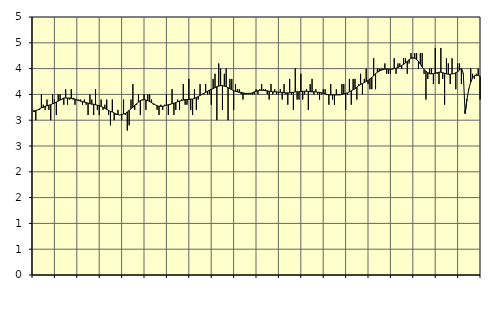
| Category | Personliga och kulturella tjänster, SNI 90-98 | Series 1 |
|---|---|---|
| nan | 3.2 | 3.16 |
| 1.0 | 3 | 3.19 |
| 1.0 | 3.2 | 3.2 |
| 1.0 | 3.2 | 3.22 |
| 1.0 | 3.5 | 3.24 |
| 1.0 | 3.3 | 3.25 |
| 1.0 | 3.2 | 3.27 |
| 1.0 | 3.4 | 3.28 |
| 1.0 | 3.2 | 3.29 |
| 1.0 | 3 | 3.3 |
| 1.0 | 3.5 | 3.32 |
| 1.0 | 3.4 | 3.33 |
| nan | 3.1 | 3.35 |
| 2.0 | 3.5 | 3.37 |
| 2.0 | 3.5 | 3.39 |
| 2.0 | 3.4 | 3.41 |
| 2.0 | 3.3 | 3.43 |
| 2.0 | 3.6 | 3.43 |
| 2.0 | 3.3 | 3.43 |
| 2.0 | 3.4 | 3.43 |
| 2.0 | 3.6 | 3.42 |
| 2.0 | 3.4 | 3.42 |
| 2.0 | 3.3 | 3.41 |
| 2.0 | 3.4 | 3.39 |
| nan | 3.4 | 3.38 |
| 3.0 | 3.4 | 3.37 |
| 3.0 | 3.3 | 3.36 |
| 3.0 | 3.4 | 3.35 |
| 3.0 | 3.3 | 3.34 |
| 3.0 | 3.1 | 3.33 |
| 3.0 | 3.5 | 3.32 |
| 3.0 | 3.4 | 3.31 |
| 3.0 | 3.1 | 3.31 |
| 3.0 | 3.6 | 3.3 |
| 3.0 | 3.2 | 3.29 |
| 3.0 | 3.1 | 3.28 |
| nan | 3.4 | 3.27 |
| 4.0 | 3.2 | 3.25 |
| 4.0 | 3.3 | 3.23 |
| 4.0 | 3.4 | 3.21 |
| 4.0 | 3.1 | 3.19 |
| 4.0 | 2.9 | 3.17 |
| 4.0 | 3.4 | 3.16 |
| 4.0 | 3 | 3.14 |
| 4.0 | 3.1 | 3.12 |
| 4.0 | 3.2 | 3.11 |
| 4.0 | 3.1 | 3.1 |
| 4.0 | 3 | 3.11 |
| nan | 3.4 | 3.12 |
| 5.0 | 3.1 | 3.13 |
| 5.0 | 2.8 | 3.16 |
| 5.0 | 2.9 | 3.19 |
| 5.0 | 3.4 | 3.22 |
| 5.0 | 3.7 | 3.25 |
| 5.0 | 3.2 | 3.29 |
| 5.0 | 3.3 | 3.32 |
| 5.0 | 3.5 | 3.35 |
| 5.0 | 3.1 | 3.38 |
| 5.0 | 3.4 | 3.39 |
| 5.0 | 3.5 | 3.4 |
| nan | 3.2 | 3.39 |
| 6.0 | 3.5 | 3.38 |
| 6.0 | 3.5 | 3.36 |
| 6.0 | 3.4 | 3.34 |
| 6.0 | 3.3 | 3.32 |
| 6.0 | 3.3 | 3.3 |
| 6.0 | 3.2 | 3.28 |
| 6.0 | 3.1 | 3.27 |
| 6.0 | 3.3 | 3.27 |
| 6.0 | 3.2 | 3.27 |
| 6.0 | 3.3 | 3.28 |
| 6.0 | 3.5 | 3.29 |
| nan | 3.1 | 3.3 |
| 7.0 | 3.3 | 3.31 |
| 7.0 | 3.6 | 3.32 |
| 7.0 | 3.1 | 3.33 |
| 7.0 | 3.2 | 3.34 |
| 7.0 | 3.4 | 3.36 |
| 7.0 | 3.2 | 3.37 |
| 7.0 | 3.4 | 3.38 |
| 7.0 | 3.7 | 3.39 |
| 7.0 | 3.3 | 3.4 |
| 7.0 | 3.3 | 3.4 |
| 7.0 | 3.8 | 3.4 |
| nan | 3.2 | 3.41 |
| 8.0 | 3.1 | 3.41 |
| 8.0 | 3.6 | 3.42 |
| 8.0 | 3.2 | 3.44 |
| 8.0 | 3.4 | 3.46 |
| 8.0 | 3.7 | 3.48 |
| 8.0 | 3.5 | 3.5 |
| 8.0 | 3.5 | 3.52 |
| 8.0 | 3.7 | 3.54 |
| 8.0 | 3.5 | 3.56 |
| 8.0 | 3.5 | 3.58 |
| 8.0 | 3.3 | 3.6 |
| nan | 3.8 | 3.61 |
| 9.0 | 3.9 | 3.63 |
| 9.0 | 3 | 3.65 |
| 9.0 | 4.1 | 3.66 |
| 9.0 | 4 | 3.67 |
| 9.0 | 3.2 | 3.67 |
| 9.0 | 3.9 | 3.66 |
| 9.0 | 4 | 3.65 |
| 9.0 | 3 | 3.63 |
| 9.0 | 3.8 | 3.61 |
| 9.0 | 3.8 | 3.59 |
| 9.0 | 3.2 | 3.57 |
| nan | 3.7 | 3.56 |
| 10.0 | 3.6 | 3.55 |
| 10.0 | 3.6 | 3.54 |
| 10.0 | 3.5 | 3.54 |
| 10.0 | 3.4 | 3.53 |
| 10.0 | 3.5 | 3.52 |
| 10.0 | 3.5 | 3.52 |
| 10.0 | 3.5 | 3.52 |
| 10.0 | 3.5 | 3.52 |
| 10.0 | 3.5 | 3.53 |
| 10.0 | 3.5 | 3.55 |
| 10.0 | 3.6 | 3.56 |
| nan | 3.5 | 3.57 |
| 11.0 | 3.6 | 3.58 |
| 11.0 | 3.7 | 3.58 |
| 11.0 | 3.6 | 3.58 |
| 11.0 | 3.6 | 3.57 |
| 11.0 | 3.5 | 3.57 |
| 11.0 | 3.4 | 3.56 |
| 11.0 | 3.7 | 3.56 |
| 11.0 | 3.5 | 3.55 |
| 11.0 | 3.6 | 3.55 |
| 11.0 | 3.5 | 3.55 |
| 11.0 | 3.5 | 3.54 |
| nan | 3.6 | 3.54 |
| 12.0 | 3.4 | 3.54 |
| 12.0 | 3.7 | 3.53 |
| 12.0 | 3.5 | 3.53 |
| 12.0 | 3.3 | 3.53 |
| 12.0 | 3.8 | 3.53 |
| 12.0 | 3.5 | 3.54 |
| 12.0 | 3.2 | 3.54 |
| 12.0 | 4 | 3.55 |
| 12.0 | 3.4 | 3.55 |
| 12.0 | 3.4 | 3.55 |
| 12.0 | 3.9 | 3.56 |
| nan | 3.4 | 3.56 |
| 13.0 | 3.5 | 3.56 |
| 13.0 | 3.6 | 3.56 |
| 13.0 | 3.2 | 3.56 |
| 13.0 | 3.7 | 3.55 |
| 13.0 | 3.8 | 3.55 |
| 13.0 | 3.5 | 3.55 |
| 13.0 | 3.6 | 3.55 |
| 13.0 | 3.5 | 3.54 |
| 13.0 | 3.4 | 3.54 |
| 13.0 | 3.5 | 3.53 |
| 13.0 | 3.6 | 3.52 |
| nan | 3.6 | 3.51 |
| 14.0 | 3.5 | 3.5 |
| 14.0 | 3.3 | 3.49 |
| 14.0 | 3.7 | 3.49 |
| 14.0 | 3.4 | 3.49 |
| 14.0 | 3.3 | 3.49 |
| 14.0 | 3.6 | 3.49 |
| 14.0 | 3.5 | 3.49 |
| 14.0 | 3.5 | 3.49 |
| 14.0 | 3.7 | 3.5 |
| 14.0 | 3.7 | 3.51 |
| 14.0 | 3.2 | 3.52 |
| nan | 3.5 | 3.53 |
| 15.0 | 3.8 | 3.55 |
| 15.0 | 3.3 | 3.57 |
| 15.0 | 3.8 | 3.59 |
| 15.0 | 3.8 | 3.61 |
| 15.0 | 3.4 | 3.64 |
| 15.0 | 3.7 | 3.67 |
| 15.0 | 3.9 | 3.69 |
| 15.0 | 3.5 | 3.71 |
| 15.0 | 3.8 | 3.73 |
| 15.0 | 4 | 3.75 |
| 15.0 | 3.7 | 3.77 |
| nan | 3.6 | 3.8 |
| 16.0 | 3.6 | 3.83 |
| 16.0 | 4.2 | 3.86 |
| 16.0 | 3.6 | 3.9 |
| 16.0 | 4 | 3.93 |
| 16.0 | 4 | 3.95 |
| 16.0 | 4 | 3.97 |
| 16.0 | 4 | 3.98 |
| 16.0 | 4.1 | 3.99 |
| 16.0 | 3.9 | 3.99 |
| 16.0 | 3.9 | 3.99 |
| 16.0 | 3.9 | 3.99 |
| nan | 4 | 3.99 |
| 17.0 | 4.2 | 4 |
| 17.0 | 3.9 | 4.01 |
| 17.0 | 4.1 | 4.02 |
| 17.0 | 4.1 | 4.04 |
| 17.0 | 4 | 4.06 |
| 17.0 | 4.2 | 4.08 |
| 17.0 | 4.2 | 4.11 |
| 17.0 | 3.9 | 4.14 |
| 17.0 | 4.1 | 4.17 |
| 17.0 | 4.3 | 4.2 |
| 17.0 | 4.2 | 4.21 |
| nan | 4.3 | 4.2 |
| 18.0 | 4.3 | 4.18 |
| 18.0 | 4 | 4.14 |
| 18.0 | 4.3 | 4.09 |
| 18.0 | 4.3 | 4.03 |
| 18.0 | 3.9 | 3.98 |
| 18.0 | 3.4 | 3.95 |
| 18.0 | 3.8 | 3.92 |
| 18.0 | 4 | 3.9 |
| 18.0 | 4 | 3.9 |
| 18.0 | 3.7 | 3.9 |
| 18.0 | 4.4 | 3.91 |
| nan | 3.9 | 3.92 |
| 19.0 | 3.7 | 3.93 |
| 19.0 | 4.4 | 3.93 |
| 19.0 | 3.8 | 3.92 |
| 19.0 | 3.3 | 3.91 |
| 19.0 | 4.2 | 3.9 |
| 19.0 | 4.1 | 3.89 |
| 19.0 | 3.7 | 3.89 |
| 19.0 | 4.2 | 3.9 |
| 19.0 | 3.9 | 3.9 |
| 19.0 | 3.6 | 3.92 |
| 19.0 | 4.1 | 3.94 |
| nan | 4.1 | 3.97 |
| 20.0 | 3.7 | 4.01 |
| 20.0 | 3.9 | 3.91 |
| 20.0 | 3.2 | 3.13 |
| 20.0 | 3.4 | 3.41 |
| 20.0 | 3.6 | 3.61 |
| 20.0 | 4 | 3.74 |
| 20.0 | 3.9 | 3.82 |
| 20.0 | 3.8 | 3.86 |
| 20.0 | 3.9 | 3.87 |
| 20.0 | 4 | 3.87 |
| 20.0 | 3.4 | 3.85 |